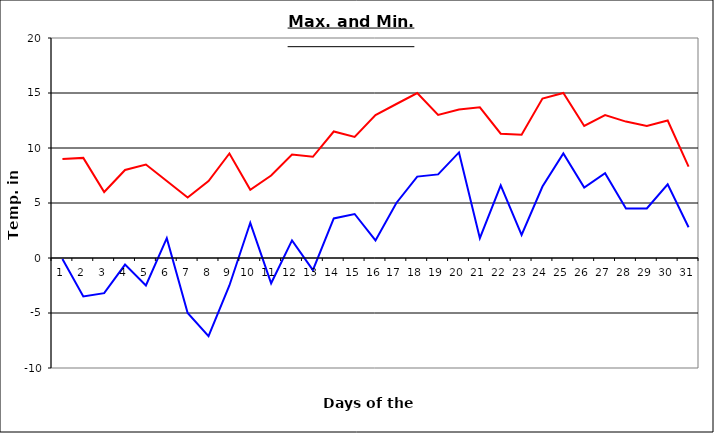
| Category | Series 0 | Series 1 |
|---|---|---|
| 0 | 9 | -0.1 |
| 1 | 9.1 | -3.5 |
| 2 | 6 | -3.2 |
| 3 | 8 | -0.6 |
| 4 | 8.5 | -2.5 |
| 5 | 7 | 1.8 |
| 6 | 5.5 | -5 |
| 7 | 7 | -7.1 |
| 8 | 9.5 | -2.5 |
| 9 | 6.2 | 3.2 |
| 10 | 7.5 | -2.3 |
| 11 | 9.4 | 1.6 |
| 12 | 9.2 | -1.1 |
| 13 | 11.5 | 3.6 |
| 14 | 11 | 4 |
| 15 | 13 | 1.6 |
| 16 | 14 | 5 |
| 17 | 15 | 7.4 |
| 18 | 13 | 7.6 |
| 19 | 13.5 | 9.6 |
| 20 | 13.7 | 1.8 |
| 21 | 11.3 | 6.6 |
| 22 | 11.2 | 2.1 |
| 23 | 14.5 | 6.5 |
| 24 | 15 | 9.5 |
| 25 | 12 | 6.4 |
| 26 | 13 | 7.7 |
| 27 | 12.4 | 4.5 |
| 28 | 12 | 4.5 |
| 29 | 12.5 | 6.7 |
| 30 | 8.3 | 2.8 |